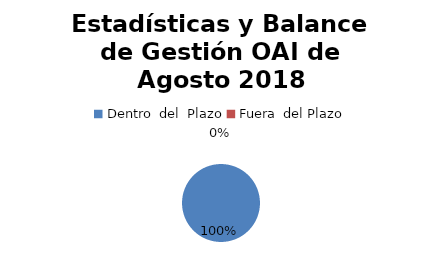
| Category | Series 0 |
|---|---|
| 0 | 2 |
| 1 | 0 |